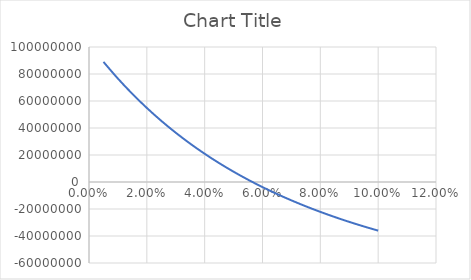
| Category | Series 0 |
|---|---|
| 0.005 | 88977050.875 |
| 0.01 | 76601454.595 |
| 0.015 | 65260617.426 |
| 0.02 | 54854071.32 |
| 0.025 | 45292074.872 |
| 0.03 | 36494384.914 |
| 0.035 | 28389176.953 |
| 0.04 | 20912095.51 |
| 0.045 | 14005417.976 |
| 0.05 | 7617317.725 |
| 0.055 | 1701214.11 |
| 0.06 | -3784801.423 |
| 0.065 | -8878472.492 |
| 0.07 | -13613826.349 |
| 0.075 | -18021571.012 |
| 0.08 | -22129447.159 |
| 0.085 | -25962540.224 |
| 0.09 | -29543557.437 |
| 0.095 | -32893073.974 |
| 0.1 | -36029751.841 |